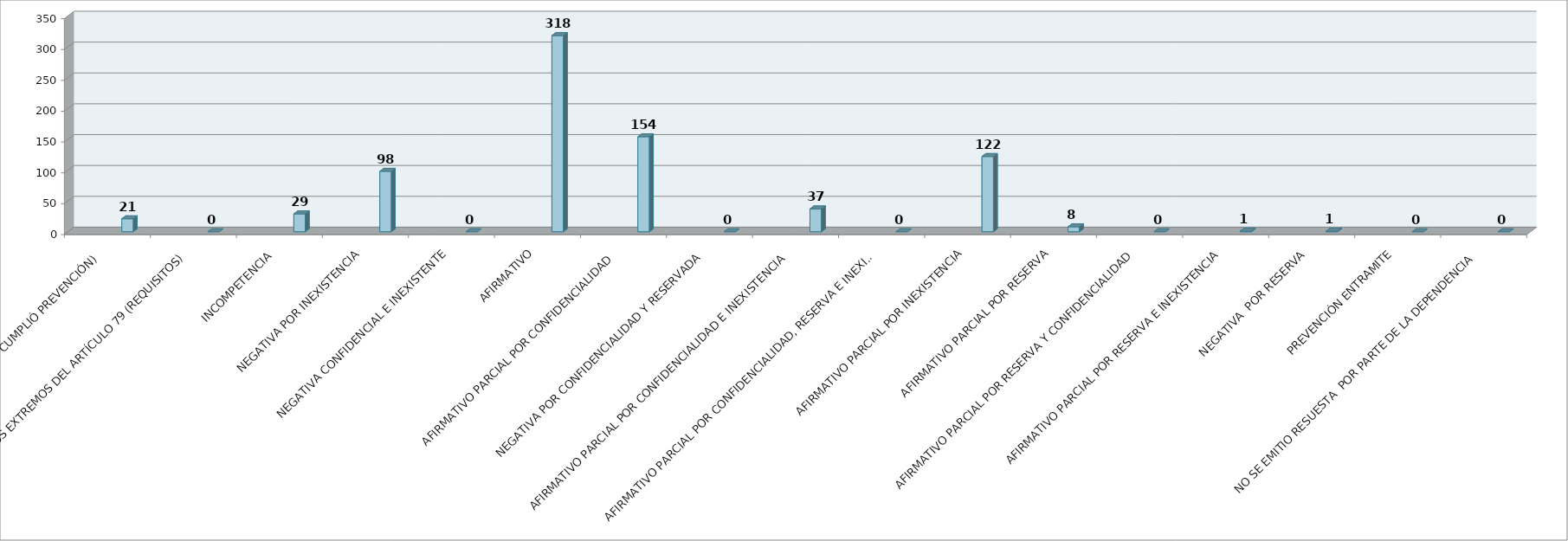
| Category | Series 0 | Series 1 | Series 2 | Series 3 | Series 4 | Series 5 |
|---|---|---|---|---|---|---|
| SE TIENE POR NO PRESENTADA ( NO CUMPLIÓ PREVENCIÓN) |  |  |  |  | 21 |  |
| NO CUMPLIO CON LOS EXTREMOS DEL ARTÍCULO 79 (REQUISITOS) |  |  |  |  | 0 |  |
| INCOMPETENCIA  |  |  |  |  | 29 |  |
| NEGATIVA POR INEXISTENCIA |  |  |  |  | 98 |  |
| NEGATIVA CONFIDENCIAL E INEXISTENTE |  |  |  |  | 0 |  |
| AFIRMATIVO |  |  |  |  | 318 |  |
| AFIRMATIVO PARCIAL POR CONFIDENCIALIDAD  |  |  |  |  | 154 |  |
| NEGATIVA POR CONFIDENCIALIDAD Y RESERVADA |  |  |  |  | 0 |  |
| AFIRMATIVO PARCIAL POR CONFIDENCIALIDAD E INEXISTENCIA |  |  |  |  | 37 |  |
| AFIRMATIVO PARCIAL POR CONFIDENCIALIDAD, RESERVA E INEXISTENCIA |  |  |  |  | 0 |  |
| AFIRMATIVO PARCIAL POR INEXISTENCIA |  |  |  |  | 122 |  |
| AFIRMATIVO PARCIAL POR RESERVA |  |  |  |  | 8 |  |
| AFIRMATIVO PARCIAL POR RESERVA Y CONFIDENCIALIDAD |  |  |  |  | 0 |  |
| AFIRMATIVO PARCIAL POR RESERVA E INEXISTENCIA |  |  |  |  | 1 |  |
| NEGATIVA  POR RESERVA |  |  |  |  | 1 |  |
| PREVENCIÓN ENTRAMITE |  |  |  |  | 0 |  |
| NO SE EMITIO RESUESTA  POR PARTE DE LA DEPENDENCIA |  |  |  |  | 0 |  |